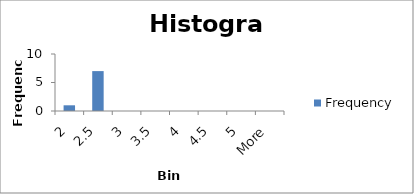
| Category | Frequency |
|---|---|
| 2 | 1 |
| 2.5 | 7 |
| 3 | 0 |
| 3.5 | 0 |
| 4 | 0 |
| 4.5 | 0 |
| 5 | 0 |
| More | 0 |